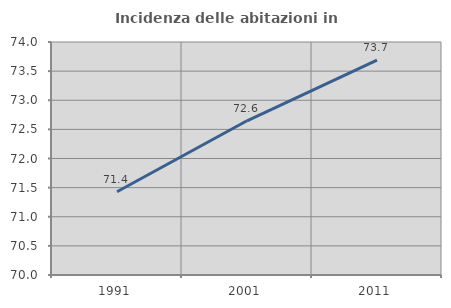
| Category | Incidenza delle abitazioni in proprietà  |
|---|---|
| 1991.0 | 71.429 |
| 2001.0 | 72.648 |
| 2011.0 | 73.689 |